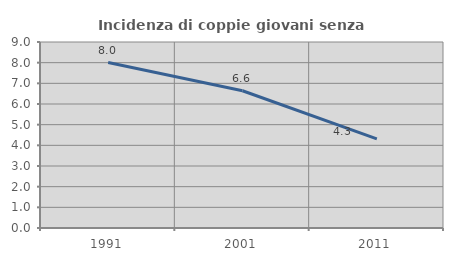
| Category | Incidenza di coppie giovani senza figli |
|---|---|
| 1991.0 | 8.006 |
| 2001.0 | 6.643 |
| 2011.0 | 4.309 |